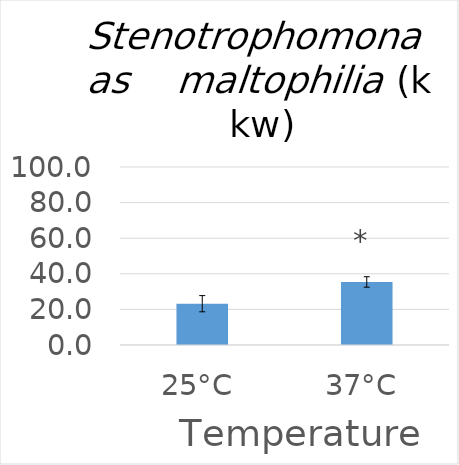
| Category | Series 0 |
|---|---|
| 25°C | 23.2 |
| 37°C | 35.42 |